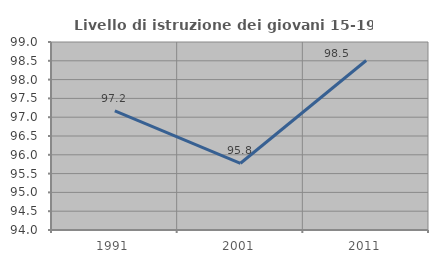
| Category | Livello di istruzione dei giovani 15-19 anni |
|---|---|
| 1991.0 | 97.17 |
| 2001.0 | 95.775 |
| 2011.0 | 98.507 |